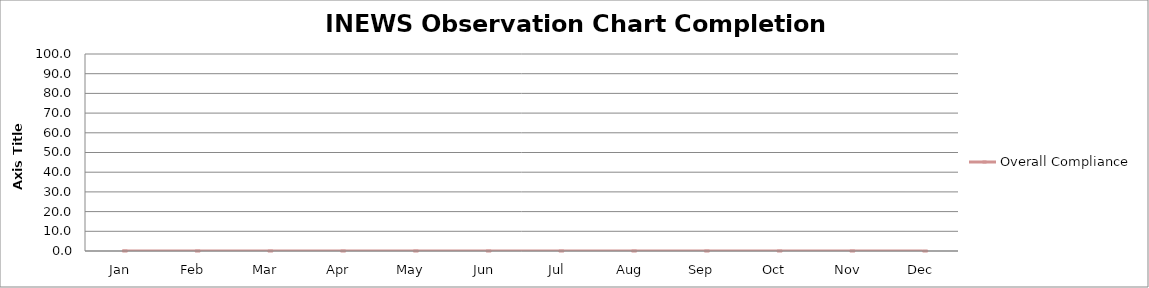
| Category | Overall Compliance |
|---|---|
| Jan | 0 |
| Feb | 0 |
| Mar | 0 |
| Apr | 0 |
| May | 0 |
| Jun | 0 |
| Jul | 0 |
| Aug | 0 |
| Sep | 0 |
| Oct | 0 |
| Nov | 0 |
| Dec | 0 |